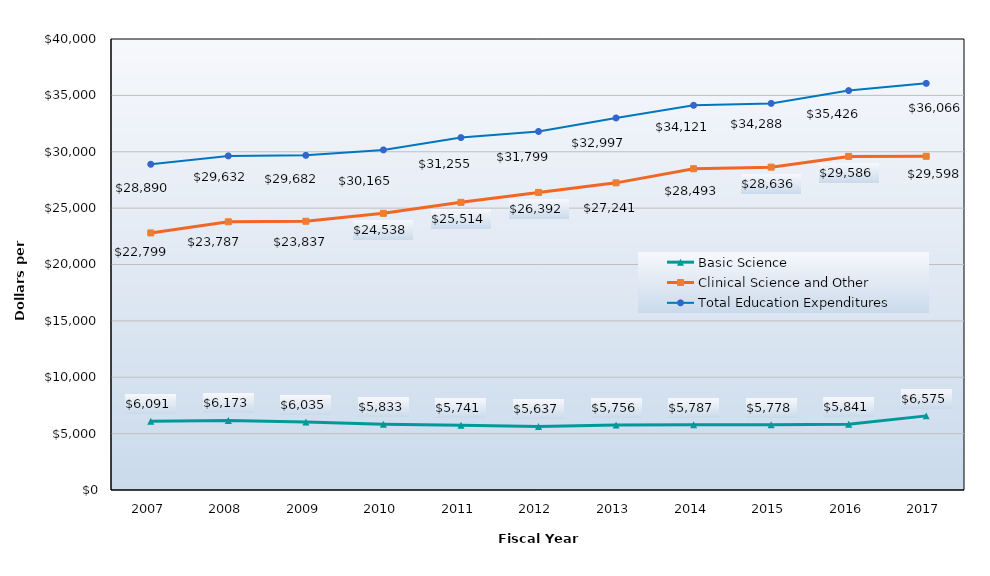
| Category | Basic Science | Clinical Science and Other | Total Education Expenditures |
|---|---|---|---|
| 2007.0 | 6091 | 22799 | 28890 |
| 2008.0 | 6173 | 23787 | 29632 |
| 2009.0 | 6035 | 23837 | 29682 |
| 2010.0 | 5833 | 24538 | 30165 |
| 2011.0 | 5741 | 25514 | 31255 |
| 2012.0 | 5637 | 26392 | 31799 |
| 2013.0 | 5756 | 27241 | 32997 |
| 2014.0 | 5787 | 28493 | 34121 |
| 2015.0 | 5778 | 28636 | 34288 |
| 2016.0 | 5841 | 29586 | 35426 |
| 2017.0 | 6575 | 29598 | 36066 |